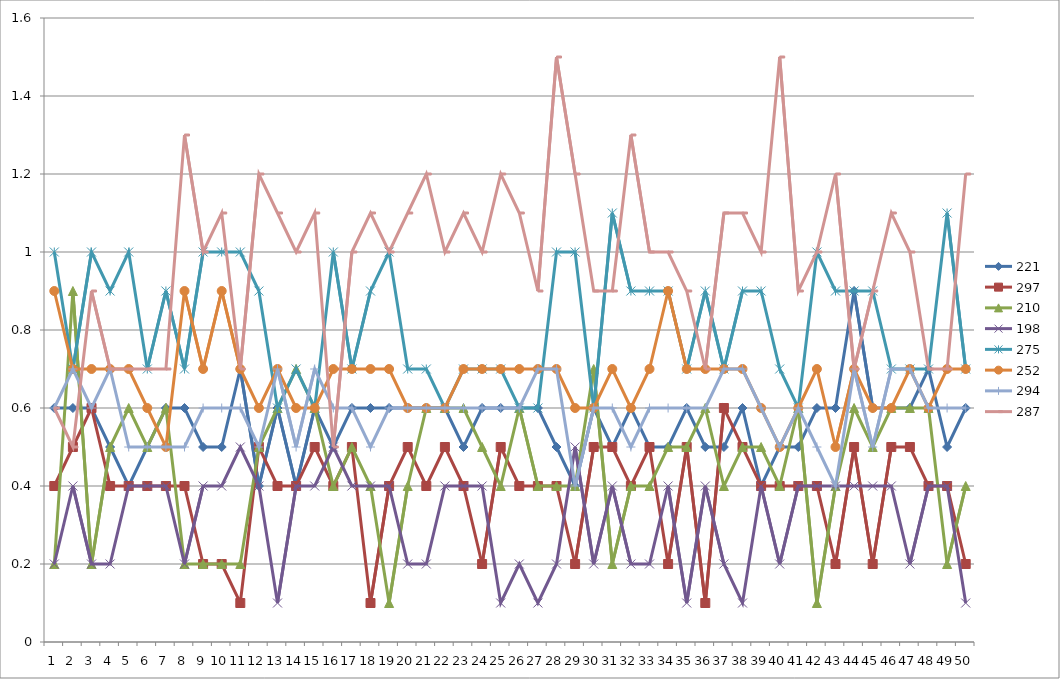
| Category | 221 | 297 | 210 | 198 | 275 | 252 | 294 | 287 |
|---|---|---|---|---|---|---|---|---|
| 0 | 0.6 | 0.4 | 0.2 | 0.2 | 1 | 0.9 | 0.6 | 0.6 |
| 1 | 0.6 | 0.5 | 0.9 | 0.4 | 0.7 | 0.7 | 0.7 | 0.5 |
| 2 | 0.6 | 0.6 | 0.2 | 0.2 | 1 | 0.7 | 0.6 | 0.9 |
| 3 | 0.5 | 0.4 | 0.5 | 0.2 | 0.9 | 0.7 | 0.7 | 0.7 |
| 4 | 0.4 | 0.4 | 0.6 | 0.4 | 1 | 0.7 | 0.5 | 0.7 |
| 5 | 0.5 | 0.4 | 0.5 | 0.4 | 0.7 | 0.6 | 0.5 | 0.7 |
| 6 | 0.6 | 0.4 | 0.6 | 0.4 | 0.9 | 0.5 | 0.5 | 0.7 |
| 7 | 0.6 | 0.4 | 0.2 | 0.2 | 0.7 | 0.9 | 0.5 | 1.3 |
| 8 | 0.5 | 0.2 | 0.2 | 0.4 | 1 | 0.7 | 0.6 | 1 |
| 9 | 0.5 | 0.2 | 0.2 | 0.4 | 1 | 0.9 | 0.6 | 1.1 |
| 10 | 0.7 | 0.1 | 0.2 | 0.5 | 1 | 0.7 | 0.6 | 0.7 |
| 11 | 0.4 | 0.5 | 0.5 | 0.4 | 0.9 | 0.6 | 0.5 | 1.2 |
| 12 | 0.6 | 0.4 | 0.6 | 0.1 | 0.6 | 0.7 | 0.7 | 1.1 |
| 13 | 0.4 | 0.4 | 0.7 | 0.4 | 0.7 | 0.6 | 0.5 | 1 |
| 14 | 0.6 | 0.5 | 0.6 | 0.4 | 0.6 | 0.6 | 0.7 | 1.1 |
| 15 | 0.5 | 0.4 | 0.4 | 0.5 | 1 | 0.7 | 0.6 | 0.5 |
| 16 | 0.6 | 0.5 | 0.5 | 0.4 | 0.7 | 0.7 | 0.6 | 1 |
| 17 | 0.6 | 0.1 | 0.4 | 0.4 | 0.9 | 0.7 | 0.5 | 1.1 |
| 18 | 0.6 | 0.4 | 0.1 | 0.4 | 1 | 0.7 | 0.6 | 1 |
| 19 | 0.6 | 0.5 | 0.4 | 0.2 | 0.7 | 0.6 | 0.6 | 1.1 |
| 20 | 0.6 | 0.4 | 0.6 | 0.2 | 0.7 | 0.6 | 0.6 | 1.2 |
| 21 | 0.6 | 0.5 | 0.6 | 0.4 | 0.6 | 0.6 | 0.6 | 1 |
| 22 | 0.5 | 0.4 | 0.6 | 0.4 | 0.7 | 0.7 | 0.6 | 1.1 |
| 23 | 0.6 | 0.2 | 0.5 | 0.4 | 0.7 | 0.7 | 0.6 | 1 |
| 24 | 0.6 | 0.5 | 0.4 | 0.1 | 0.7 | 0.7 | 0.6 | 1.2 |
| 25 | 0.6 | 0.4 | 0.6 | 0.2 | 0.6 | 0.7 | 0.6 | 1.1 |
| 26 | 0.6 | 0.4 | 0.4 | 0.1 | 0.6 | 0.7 | 0.7 | 0.9 |
| 27 | 0.5 | 0.4 | 0.4 | 0.2 | 1 | 0.7 | 0.7 | 1.5 |
| 28 | 0.4 | 0.2 | 0.4 | 0.5 | 1 | 0.6 | 0.4 | 1.2 |
| 29 | 0.6 | 0.5 | 0.7 | 0.2 | 0.6 | 0.6 | 0.6 | 0.9 |
| 30 | 0.5 | 0.5 | 0.2 | 0.4 | 1.1 | 0.7 | 0.6 | 0.9 |
| 31 | 0.6 | 0.4 | 0.4 | 0.2 | 0.9 | 0.6 | 0.5 | 1.3 |
| 32 | 0.5 | 0.5 | 0.4 | 0.2 | 0.9 | 0.7 | 0.6 | 1 |
| 33 | 0.5 | 0.2 | 0.5 | 0.4 | 0.9 | 0.9 | 0.6 | 1 |
| 34 | 0.6 | 0.5 | 0.5 | 0.1 | 0.7 | 0.7 | 0.6 | 0.9 |
| 35 | 0.5 | 0.1 | 0.6 | 0.4 | 0.9 | 0.7 | 0.6 | 0.7 |
| 36 | 0.5 | 0.6 | 0.4 | 0.2 | 0.7 | 0.7 | 0.7 | 1.1 |
| 37 | 0.6 | 0.5 | 0.5 | 0.1 | 0.9 | 0.7 | 0.7 | 1.1 |
| 38 | 0.4 | 0.4 | 0.5 | 0.4 | 0.9 | 0.6 | 0.6 | 1 |
| 39 | 0.5 | 0.4 | 0.4 | 0.2 | 0.7 | 0.5 | 0.5 | 1.5 |
| 40 | 0.5 | 0.4 | 0.6 | 0.4 | 0.6 | 0.6 | 0.6 | 0.9 |
| 41 | 0.6 | 0.4 | 0.1 | 0.4 | 1 | 0.7 | 0.5 | 1 |
| 42 | 0.6 | 0.2 | 0.4 | 0.4 | 0.9 | 0.5 | 0.4 | 1.2 |
| 43 | 0.9 | 0.5 | 0.6 | 0.4 | 0.9 | 0.7 | 0.7 | 0.7 |
| 44 | 0.6 | 0.2 | 0.5 | 0.4 | 0.9 | 0.6 | 0.5 | 0.9 |
| 45 | 0.6 | 0.5 | 0.6 | 0.4 | 0.7 | 0.6 | 0.7 | 1.1 |
| 46 | 0.6 | 0.5 | 0.6 | 0.2 | 0.7 | 0.7 | 0.7 | 1 |
| 47 | 0.7 | 0.4 | 0.6 | 0.4 | 0.7 | 0.6 | 0.6 | 0.7 |
| 48 | 0.5 | 0.4 | 0.2 | 0.4 | 1.1 | 0.7 | 0.6 | 0.7 |
| 49 | 0.6 | 0.2 | 0.4 | 0.1 | 0.7 | 0.7 | 0.6 | 1.2 |